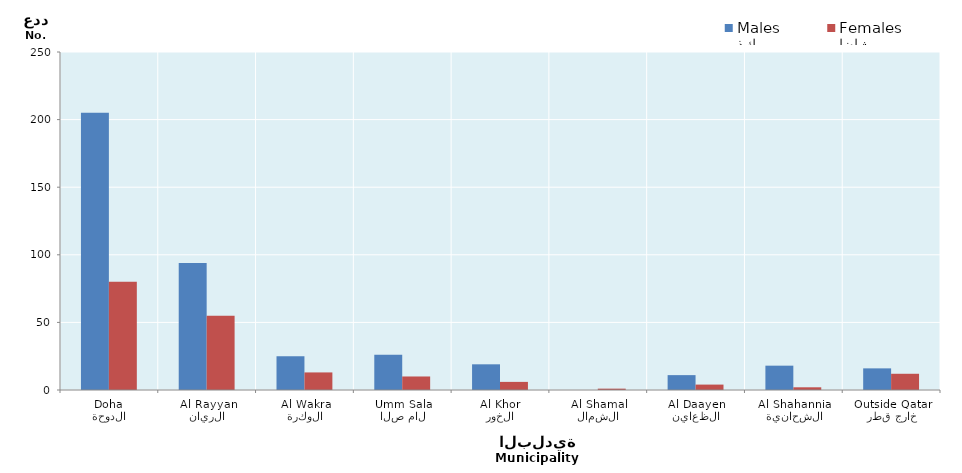
| Category | ذكور
Males | إناث
Females |
|---|---|---|
| الدوحة
Doha | 205 | 80 |
| الريان
Al Rayyan | 94 | 55 |
| الوكرة
Al Wakra | 25 | 13 |
| ام صلال
Umm Salal | 26 | 10 |
| الخور
Al Khor | 19 | 6 |
| الشمال
Al Shamal | 0 | 1 |
| الظعاين
Al Daayen | 11 | 4 |
| الشحانية
Al Shahannia | 18 | 2 |
| خارج قطر
Outside Qatar | 16 | 12 |